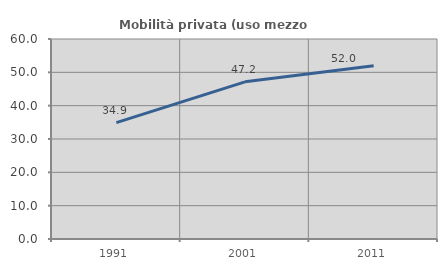
| Category | Mobilità privata (uso mezzo privato) |
|---|---|
| 1991.0 | 34.916 |
| 2001.0 | 47.154 |
| 2011.0 | 52 |